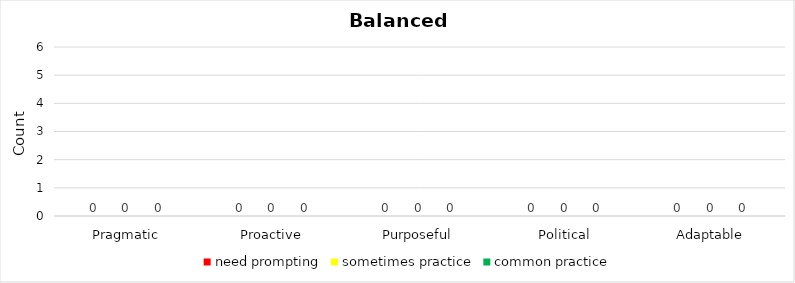
| Category | need prompting | sometimes practice | common practice |
|---|---|---|---|
| Pragmatic | 0 | 0 | 0 |
| Proactive | 0 | 0 | 0 |
| Purposeful | 0 | 0 | 0 |
| Political | 0 | 0 | 0 |
| Adaptable | 0 | 0 | 0 |